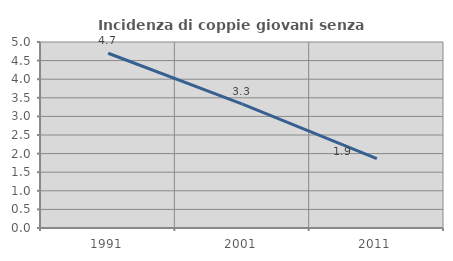
| Category | Incidenza di coppie giovani senza figli |
|---|---|
| 1991.0 | 4.697 |
| 2001.0 | 3.331 |
| 2011.0 | 1.865 |